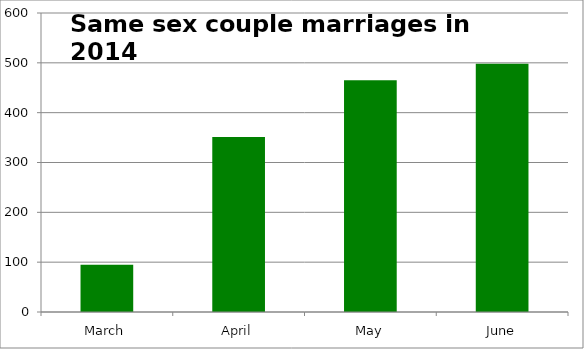
| Category | Series 0 |
|---|---|
| March | 95 |
| April | 351 |
| May | 465 |
| June | 498 |